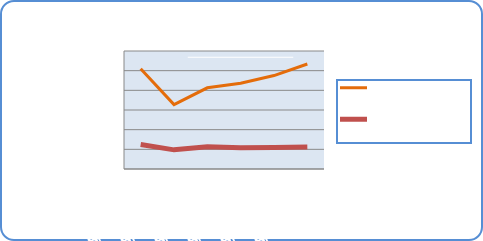
| Category | Motorin Türleri  | Benzin Türleri |
|---|---|---|
| 8/20/18 | 50924445.521 | 12487016.535 |
| 8/21/18 | 32736211.39 | 9734494.499 |
| 8/22/18 | 41276642.784 | 11252137.631 |
| 8/23/18 | 43603297.114 | 10859355.399 |
| 8/24/18 | 47512518.258 | 10939152.454 |
| 8/25/18 | 53392449.543 | 11222446.536 |